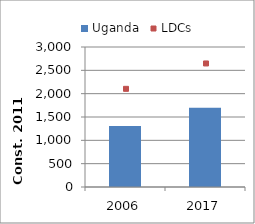
| Category | Uganda |
|---|---|
| 2006.0 | 1308.422 |
| 2017.0 | 1698.061 |